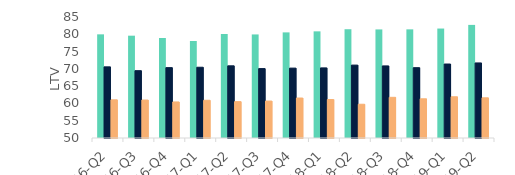
| Category | First-time
buyers | Homemovers | Homowner remortgaging |
|---|---|---|---|
| 16-Q2 | 79.984 | 70.578 | 61.037 |
| 16-Q3 | 79.596 | 69.474 | 60.978 |
| 16-Q4 | 78.925 | 70.355 | 60.426 |
| 17-Q1 | 78.059 | 70.466 | 60.913 |
| 17-Q2 | 80.09 | 70.879 | 60.514 |
| 17-Q3 | 79.956 | 70.078 | 60.689 |
| 17-Q4 | 80.549 | 70.216 | 61.564 |
| 18-Q1 | 80.849 | 70.276 | 61.124 |
| 18-Q2 | 81.464 | 71.084 | 59.763 |
| 18-Q3 | 81.407 | 70.85 | 61.766 |
| 18-Q4 | 81.428 | 70.339 | 61.339 |
| 19-Q1 | 81.662 | 71.398 | 61.927 |
| 19-Q2 | 82.716 | 71.712 | 61.623 |